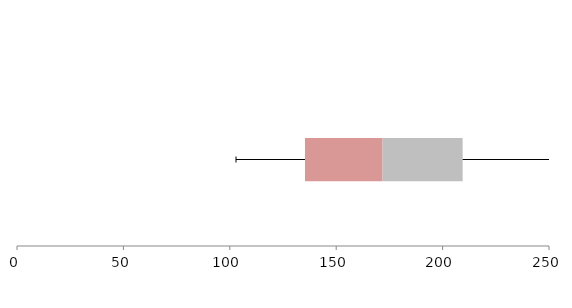
| Category | Series 1 | Series 2 | Series 3 |
|---|---|---|---|
| 0 | 135.328 | 36.461 | 37.631 |